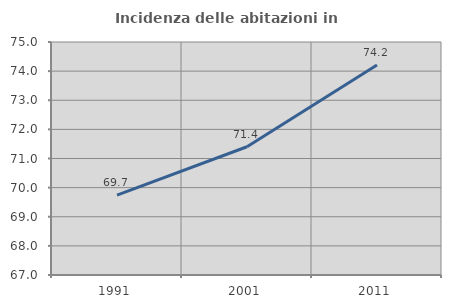
| Category | Incidenza delle abitazioni in proprietà  |
|---|---|
| 1991.0 | 69.74 |
| 2001.0 | 71.404 |
| 2011.0 | 74.209 |